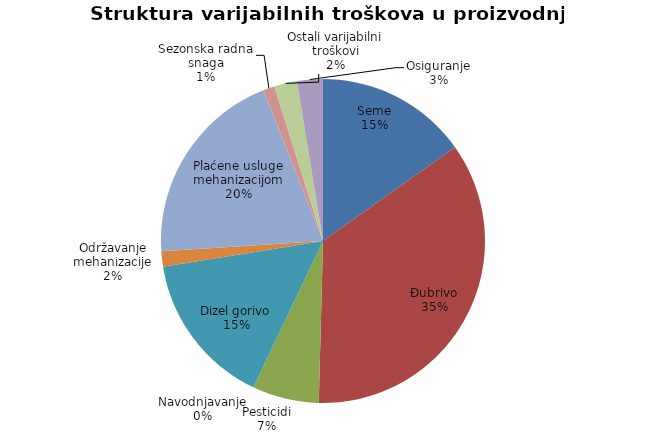
| Category | Series 0 |
|---|---|
| Seme | 10000 |
| Đubrivo | 23250 |
| Pesticidi | 4390 |
| Navodnjavanje | 0 |
| Dizel gorivo | 10150 |
| Održavanje mehanizacije | 1009.615 |
| Plaćene usluge mehanizacijom | 13200 |
| Sezonska radna snaga | 750 |
| Ostali varijabilni troškovi | 1500 |
| Osiguranje | 1700 |